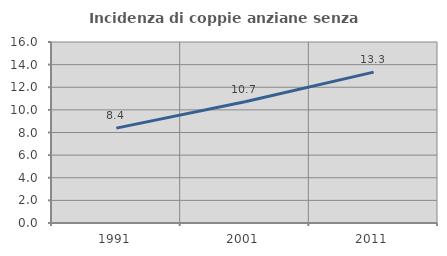
| Category | Incidenza di coppie anziane senza figli  |
|---|---|
| 1991.0 | 8.388 |
| 2001.0 | 10.718 |
| 2011.0 | 13.338 |